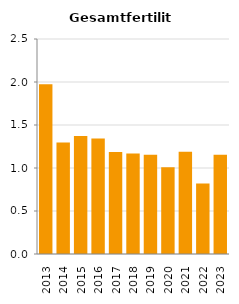
| Category | Gesamtfertilität |
|---|---|
| 2013.0 | 1.973 |
| 2014.0 | 1.296 |
| 2015.0 | 1.373 |
| 2016.0 | 1.344 |
| 2017.0 | 1.185 |
| 2018.0 | 1.168 |
| 2019.0 | 1.153 |
| 2020.0 | 1.01 |
| 2021.0 | 1.188 |
| 2022.0 | 0.82 |
| 2023.0 | 1.155 |